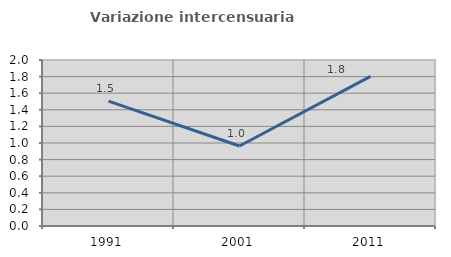
| Category | Variazione intercensuaria annua |
|---|---|
| 1991.0 | 1.504 |
| 2001.0 | 0.964 |
| 2011.0 | 1.802 |